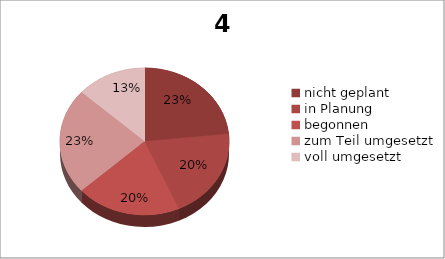
| Category | 4.1 Beratung |
|---|---|
| nicht geplant | 7 |
| in Planung | 6 |
| begonnen | 6 |
| zum Teil umgesetzt | 7 |
| voll umgesetzt | 4 |